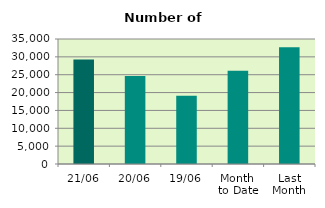
| Category | Series 0 |
|---|---|
| 21/06 | 29294 |
| 20/06 | 24610 |
| 19/06 | 19094 |
| Month 
to Date | 26113.733 |
| Last
Month | 32723.818 |